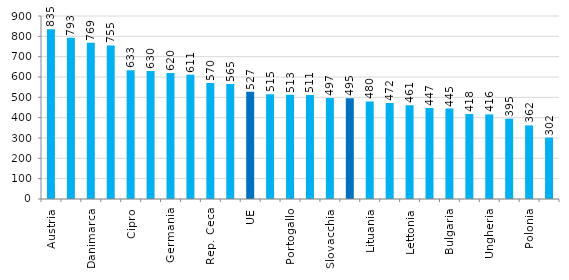
| Category | : |
|---|---|
| Austria | 835 |
| Lussemburgo | 793 |
| Danimarca | 769 |
| Belgio | 755 |
| Cipro | 633 |
| Finlandia | 630 |
| Germania | 620 |
| Malta | 611 |
| Rep. Ceca | 570 |
| Francia | 565 |
| UE | 527 |
| Paesi Bassi | 515 |
| Portogallo | 513 |
| Slovenia | 511 |
| Slovacchia | 497 |
| Italia | 495 |
| Lituania | 480 |
| Spagna | 472 |
| Lettonia | 461 |
| Croazia | 447 |
| Bulgaria | 445 |
| Svezia | 418 |
| Ungheria | 416 |
| Estonia | 395 |
| Polonia | 362 |
| Romania | 302 |